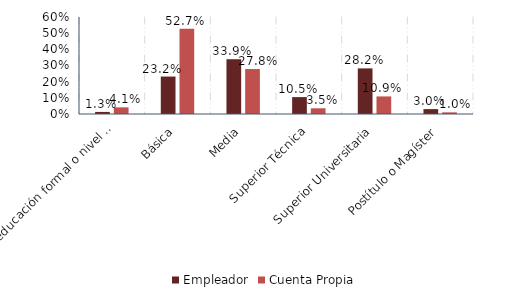
| Category | Empleador | Cuenta Propia |
|---|---|---|
| Sin educación formal o nivel ignorado | 0.013 | 0.041 |
| Básica | 0.232 | 0.527 |
| Media | 0.339 | 0.278 |
| Superior Técnica | 0.104 | 0.035 |
| Superior Universitaria | 0.282 | 0.109 |
| Postítulo o Magíster | 0.03 | 0.01 |